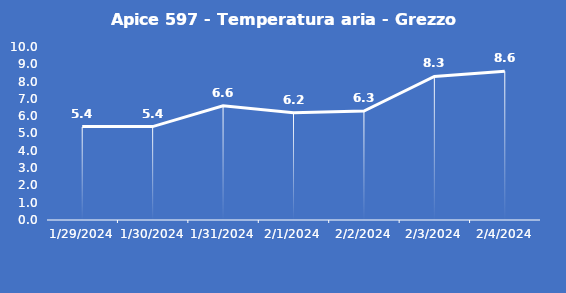
| Category | Apice 597 - Temperatura aria - Grezzo (°C) |
|---|---|
| 1/29/24 | 5.4 |
| 1/30/24 | 5.4 |
| 1/31/24 | 6.6 |
| 2/1/24 | 6.2 |
| 2/2/24 | 6.3 |
| 2/3/24 | 8.3 |
| 2/4/24 | 8.6 |